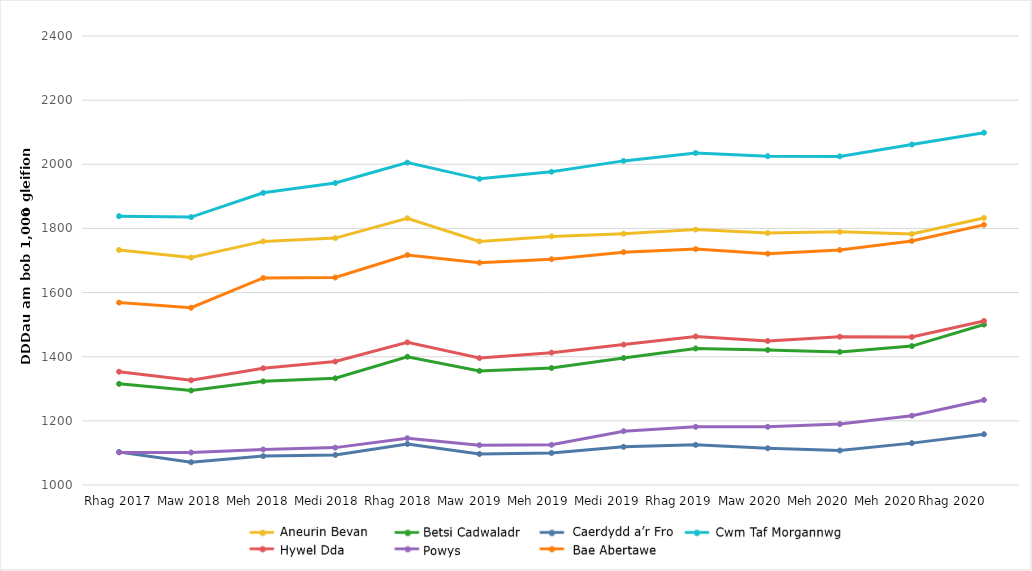
| Category | Aneurin Bevan | Betsi Cadwaladr | Cardiff And Vale | Cwm Taf Morgannwg | Hywel Dda | Powys | Swansea Bay |
|---|---|---|---|---|---|---|---|
| Dec 2017 | 1732.85 | 1315.342 | 1103.017 | 1838.295 | 1353.219 | 1101.55 | 1568.735 |
| Mar 2018 | 1709.116 | 1294.61 | 1071.08 | 1835.298 | 1326.582 | 1101.299 | 1552.641 |
| Jun 2018 | 1759.6 | 1323.257 | 1090.136 | 1910.974 | 1363.962 | 1110.715 | 1645.514 |
| Sep 2018 | 1769.879 | 1332.718 | 1093.727 | 1941.746 | 1384.94 | 1116.575 | 1646.819 |
| Dec 2018 | 1831.696 | 1399.905 | 1127.856 | 2005.084 | 1444.79 | 1145.819 | 1717.167 |
| Mar 2019 | 1759.617 | 1355.705 | 1096.537 | 1954.603 | 1395.751 | 1124.179 | 1693.166 |
| Jun 2019 | 1775.141 | 1364.783 | 1099.85 | 1976.674 | 1412.719 | 1125.328 | 1704.019 |
| Sep 2019 | 1783.453 | 1395.983 | 1119.138 | 2010.586 | 1437.749 | 1167.777 | 1725.854 |
| Dec 2019 | 1796.344 | 1425.676 | 1125.112 | 2035.156 | 1463.266 | 1181.498 | 1735.504 |
| Mar 2020 | 1785.763 | 1421.016 | 1114.526 | 2025.287 | 1449.075 | 1181.536 | 1721.151 |
| Jun 2020 | 1789.369 | 1414.91 | 1107.472 | 2024.606 | 1462.328 | 1189.954 | 1732.732 |
| Sep 2020 | 1782.634 | 1433.16 | 1130.584 | 2061.523 | 1461.466 | 1216.146 | 1760.906 |
| Dec 2020 | 1832.646 | 1500.311 | 1158.296 | 2098.59 | 1511.473 | 1265.097 | 1811.152 |